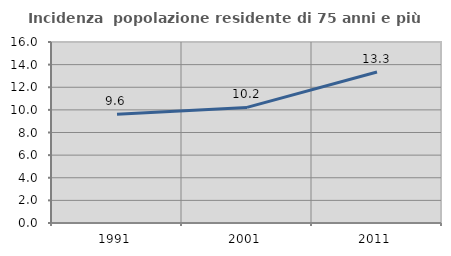
| Category | Incidenza  popolazione residente di 75 anni e più |
|---|---|
| 1991.0 | 9.609 |
| 2001.0 | 10.217 |
| 2011.0 | 13.348 |